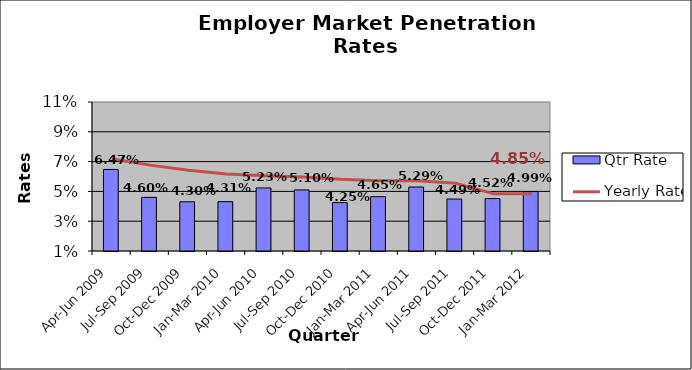
| Category | Qtr Rate |
|---|---|
| Apr-Jun 2009 | 0.065 |
| Jul-Sep 2009 | 0.046 |
| Oct-Dec 2009 | 0.043 |
| Jan-Mar 2010 | 0.043 |
| Apr-Jun 2010 | 0.052 |
| Jul-Sep 2010 | 0.051 |
| Oct-Dec 2010 | 0.042 |
| Jan-Mar 2011 | 0.046 |
| Apr-Jun 2011 | 0.053 |
| Jul-Sep 2011 | 0.045 |
| Oct-Dec 2011 | 0.045 |
| Jan-Mar 2012 | 0.05 |